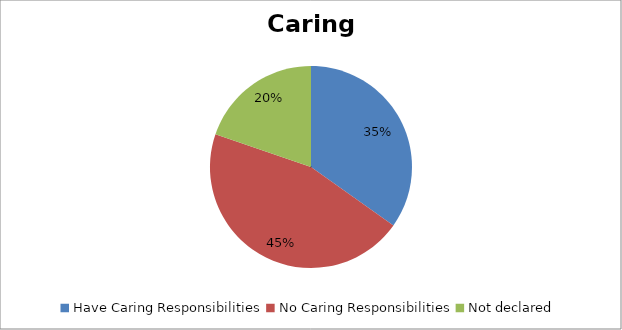
| Category | Total % |
|---|---|
| Have Caring Responsibilities | 0.348 |
| No Caring Responsibilities | 0.454 |
| Not declared | 0.197 |